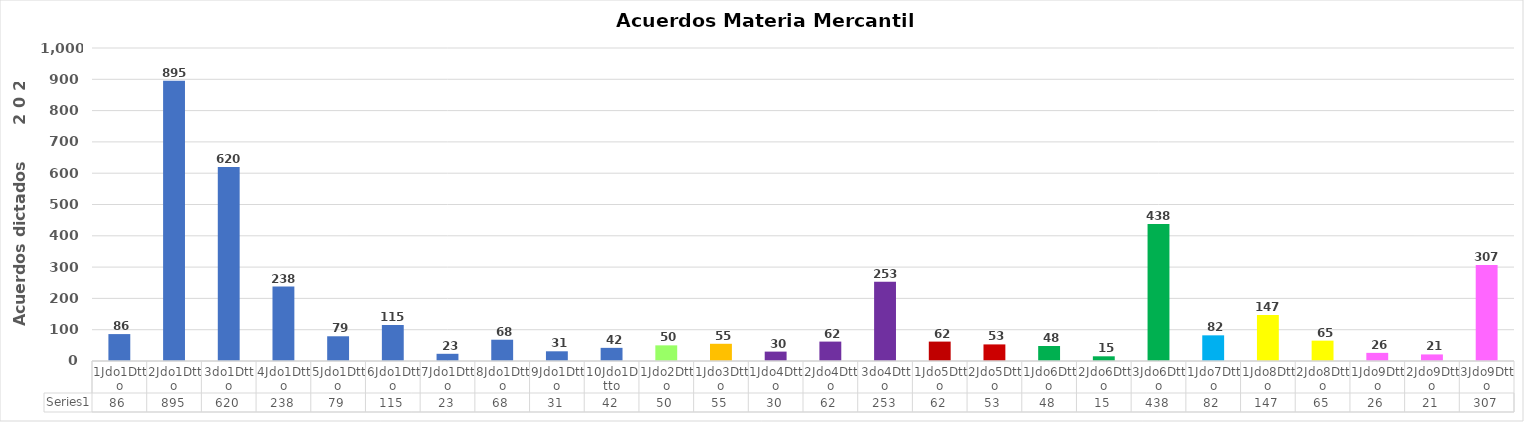
| Category | Series 0 |
|---|---|
| 1Jdo1Dtto | 86 |
| 2Jdo1Dtto | 895 |
| 3do1Dtto | 620 |
| 4Jdo1Dtto | 238 |
| 5Jdo1Dtto | 79 |
| 6Jdo1Dtto | 115 |
| 7Jdo1Dtto | 23 |
| 8Jdo1Dtto | 68 |
| 9Jdo1Dtto | 31 |
| 10Jdo1Dtto | 42 |
| 1Jdo2Dtto | 50 |
| 1Jdo3Dtto | 55 |
| 1Jdo4Dtto | 30 |
| 2Jdo4Dtto | 62 |
| 3do4Dtto | 253 |
| 1Jdo5Dtto | 62 |
| 2Jdo5Dtto | 53 |
| 1Jdo6Dtto | 48 |
| 2Jdo6Dtto | 15 |
| 3Jdo6Dtto | 438 |
| 1Jdo7Dtto | 82 |
| 1Jdo8Dtto | 147 |
| 2Jdo8Dtto | 65 |
| 1Jdo9Dtto | 26 |
| 2Jdo9Dtto | 21 |
| 3Jdo9Dtto | 307 |